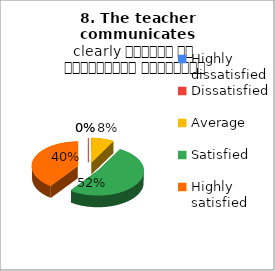
| Category | 8. The teacher communicates clearly शिक्षक का सम्प्रेषण सुस्पष्ट है |
|---|---|
| Highly dissatisfied | 0 |
| Dissatisfied | 0 |
| Average | 2 |
| Satisfied | 13 |
| Highly satisfied | 10 |